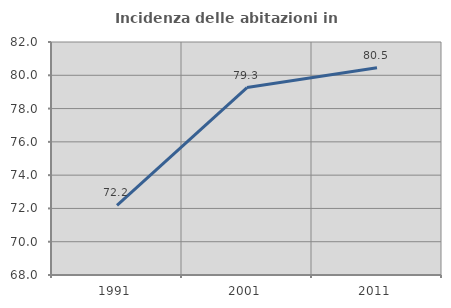
| Category | Incidenza delle abitazioni in proprietà  |
|---|---|
| 1991.0 | 72.183 |
| 2001.0 | 79.264 |
| 2011.0 | 80.457 |